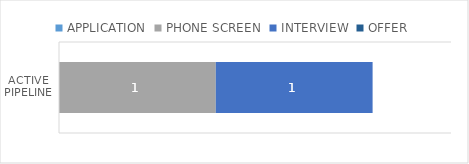
| Category | APPLICATION | PHONE SCREEN | INTERVIEW | OFFER |
|---|---|---|---|---|
| 0 | 0 | 1 | 1 | 0 |